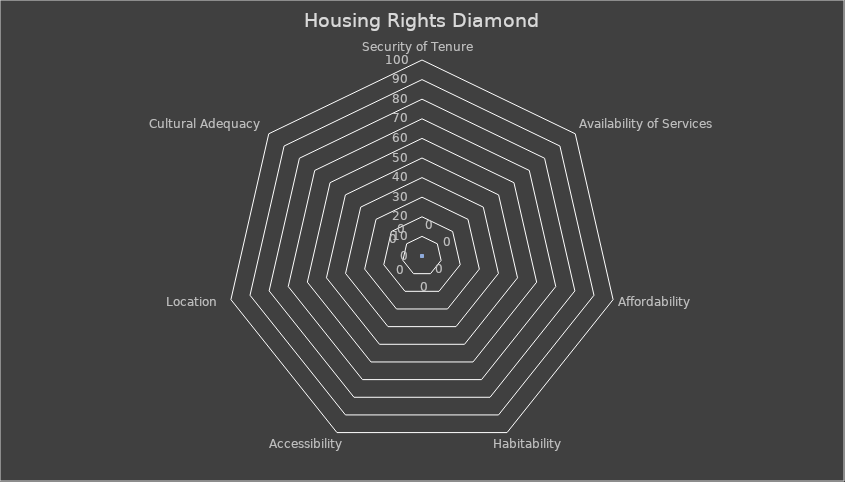
| Category | Series 0 |
|---|---|
| Security of Tenure  | 0 |
| Availability of Services  | 0 |
| Affordability  | 0 |
| Habitability  | 0 |
| Accessibility  | 0 |
| Location  | 0 |
| Cultural Adequacy | 0 |